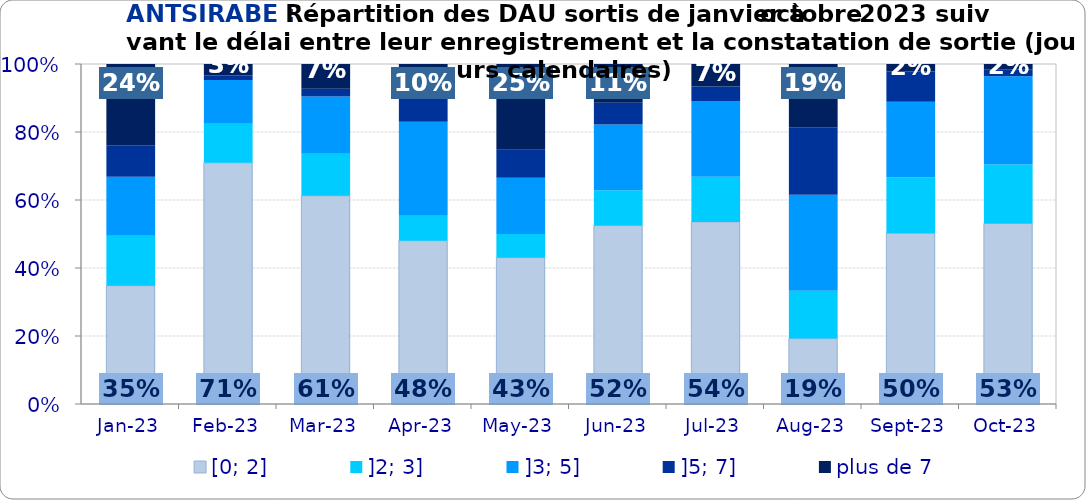
| Category | [0; 2] | ]2; 3] | ]3; 5] | ]5; 7] | plus de 7 |
|---|---|---|---|---|---|
| 2023-01-01 | 0.348 | 0.147 | 0.174 | 0.092 | 0.239 |
| 2023-02-01 | 0.709 | 0.115 | 0.128 | 0.014 | 0.034 |
| 2023-03-01 | 0.612 | 0.124 | 0.169 | 0.022 | 0.073 |
| 2023-04-01 | 0.48 | 0.073 | 0.277 | 0.068 | 0.102 |
| 2023-05-01 | 0.43 | 0.07 | 0.165 | 0.083 | 0.252 |
| 2023-06-01 | 0.525 | 0.104 | 0.193 | 0.064 | 0.114 |
| 2023-07-01 | 0.536 | 0.133 | 0.223 | 0.043 | 0.066 |
| 2023-08-01 | 0.192 | 0.141 | 0.282 | 0.199 | 0.186 |
| 2023-09-01 | 0.502 | 0.164 | 0.222 | 0.089 | 0.022 |
| 2023-10-01 | 0.531 | 0.173 | 0.26 | 0.02 | 0.015 |